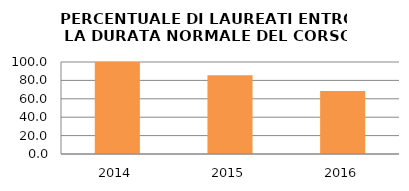
| Category | 2014 2015 2016 |
|---|---|
| 2014.0 | 100 |
| 2015.0 | 85.714 |
| 2016.0 | 68.421 |